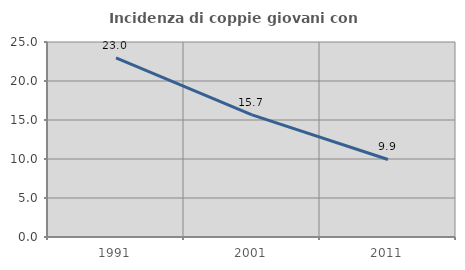
| Category | Incidenza di coppie giovani con figli |
|---|---|
| 1991.0 | 22.967 |
| 2001.0 | 15.665 |
| 2011.0 | 9.94 |